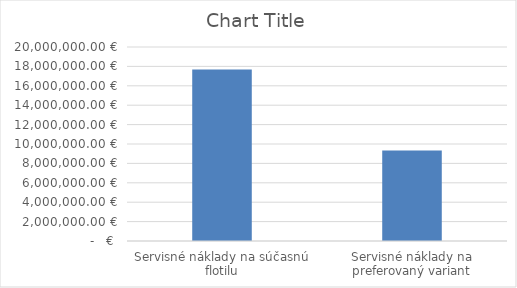
| Category | Series 0 |
|---|---|
| Servisné náklady na súčasnú flotilu | 17676452.267 |
| Servisné náklady na preferovaný variant | 9332639.609 |